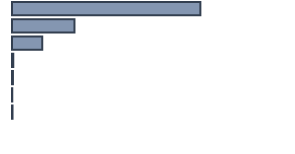
| Category | Series 0 |
|---|---|
| 0 | 68.75 |
| 1 | 22.8 |
| 2 | 11.001 |
| 3 | 0.466 |
| 4 | 0.345 |
| 5 | 0.1 |
| 6 | 0.19 |
| 7 | 0 |